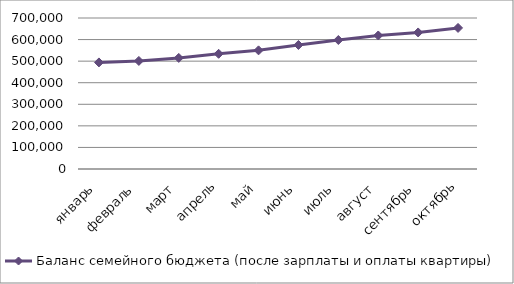
| Category | Баланс семейного бюджета (после зарплаты и оплаты квартиры) |
|---|---|
| январь | 494000 |
| февраль | 501000 |
| март | 515000 |
| апрель | 534000 |
| май | 550000 |
| июнь | 575000 |
| июль | 598000 |
| август | 619000 |
| сентябрь | 633000 |
| октябрь | 654000 |